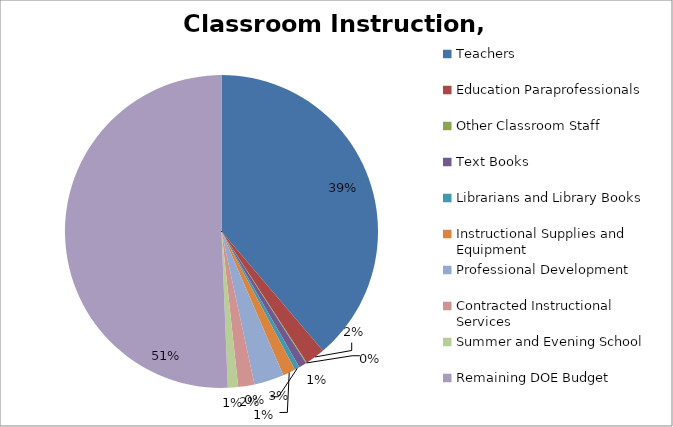
| Category | Series 0 |
|---|---|
| Teachers  | 6862 |
| Education Paraprofessionals  | 362 |
| Other Classroom Staff  | 16 |
| Text Books  | 140 |
| Librarians and Library Books  | 91 |
| Instructional Supplies and Equipment  | 233 |
| Professional Development  | 544 |
| Contracted Instructional Services  | 298 |
| Summer and Evening School  | 188 |
| Remaining DOE Budget | 8961 |